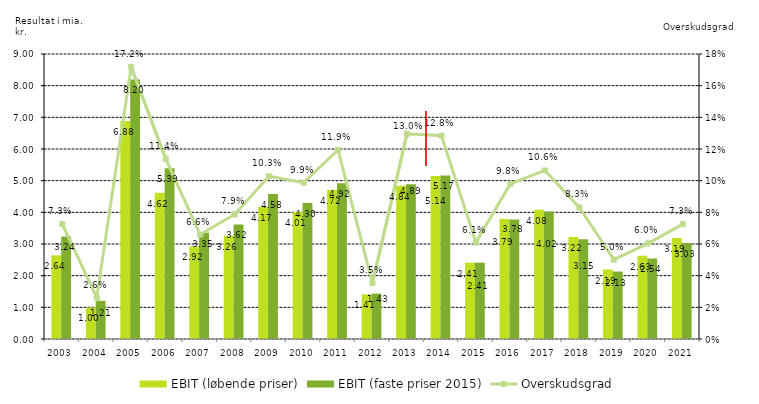
| Category | EBIT (løbende priser) | EBIT (faste priser 2015) |
|---|---|---|
| 2003.0 | 2.643 | 3.239 |
| 2004.0 | 0.995 | 1.206 |
| 2005.0 | 6.885 | 8.196 |
| 2006.0 | 4.616 | 5.393 |
| 2007.0 | 2.922 | 3.355 |
| 2008.0 | 3.26 | 3.618 |
| 2009.0 | 4.174 | 4.576 |
| 2010.0 | 4.007 | 4.295 |
| 2011.0 | 4.716 | 4.917 |
| 2012.0 | 1.408 | 1.434 |
| 2013.0 | 4.838 | 4.886 |
| 2014.0 | 5.145 | 5.165 |
| 2015.0 | 2.41 | 2.41 |
| 2016.0 | 3.787 | 3.776 |
| 2017.0 | 4.078 | 4.023 |
| 2018.0 | 3.22 | 3.151 |
| 2019.0 | 2.194 | 2.131 |
| 2020.0 | 2.63 | 2.543 |
| 2021.0 | 3.193 | 3.031 |